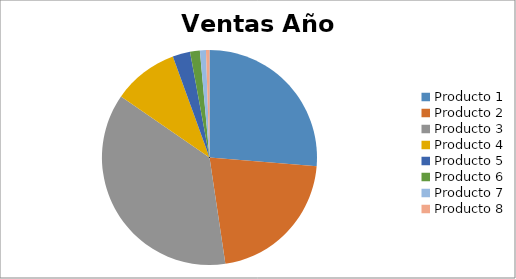
| Category | Ventas Año 2008 |
|---|---|
| Producto 1 | 32000 |
| Producto 2 | 26000 |
| Producto 3 | 45000 |
| Producto 4 | 12000 |
| Producto 5 | 3200 |
| Producto 6 | 1800 |
| Producto 7 | 1100 |
| Producto 8 | 640 |